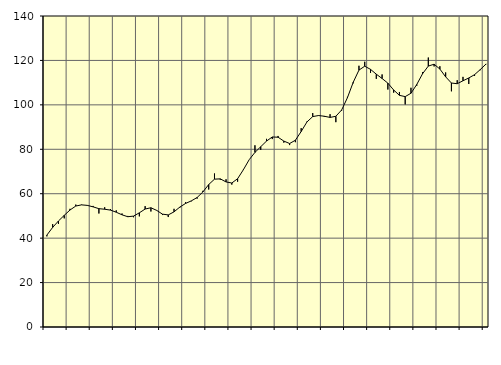
| Category | Piggar | Series 1 |
|---|---|---|
| nan | 40.8 | 41.38 |
| 1.0 | 46.3 | 44.83 |
| 1.0 | 46.4 | 47.72 |
| 1.0 | 48.9 | 50.26 |
| nan | 53.2 | 52.66 |
| 2.0 | 55.1 | 54.45 |
| 2.0 | 55.1 | 54.98 |
| 2.0 | 54.6 | 54.75 |
| nan | 54.5 | 54.08 |
| 3.0 | 51.1 | 53.27 |
| 3.0 | 53.9 | 53.01 |
| 3.0 | 53.1 | 52.62 |
| nan | 52.5 | 51.67 |
| 4.0 | 51.1 | 50.5 |
| 4.0 | 50 | 49.64 |
| 4.0 | 49.4 | 49.92 |
| nan | 49.8 | 51.4 |
| 5.0 | 54.4 | 53.1 |
| 5.0 | 52 | 53.68 |
| 5.0 | 52.4 | 52.49 |
| nan | 50.4 | 50.8 |
| 6.0 | 49.5 | 50.46 |
| 6.0 | 53.2 | 51.84 |
| 6.0 | 53.7 | 53.98 |
| nan | 56.2 | 55.62 |
| 7.0 | 56.6 | 56.79 |
| 7.0 | 57.8 | 58.3 |
| 7.0 | 61.3 | 60.81 |
| nan | 61.9 | 64.13 |
| 8.0 | 69.1 | 66.55 |
| 8.0 | 66.3 | 66.69 |
| 8.0 | 66.5 | 65.3 |
| nan | 64.1 | 64.83 |
| 9.0 | 65.4 | 66.75 |
| 9.0 | 71 | 70.8 |
| 9.0 | 75.3 | 75.3 |
| nan | 81.8 | 78.6 |
| 10.0 | 79.7 | 81.15 |
| 10.0 | 84.7 | 83.69 |
| 10.0 | 84.6 | 85.54 |
| nan | 86 | 85.43 |
| 11.0 | 83 | 83.69 |
| 11.0 | 81.9 | 82.6 |
| 11.0 | 83.2 | 84.07 |
| nan | 89.5 | 88.01 |
| 12.0 | 92.5 | 92.3 |
| 12.0 | 96.3 | 94.72 |
| 12.0 | 95.3 | 95.19 |
| nan | 94.6 | 94.88 |
| 13.0 | 95.8 | 94.34 |
| 13.0 | 92.2 | 94.86 |
| 13.0 | 97.4 | 97.69 |
| nan | 103.6 | 103.2 |
| 14.0 | 109.7 | 110.14 |
| 14.0 | 117.6 | 115.65 |
| 14.0 | 119.4 | 117.4 |
| nan | 114.4 | 115.98 |
| 15.0 | 111.7 | 113.81 |
| 15.0 | 113.7 | 111.87 |
| 15.0 | 106.9 | 109.77 |
| nan | 105.5 | 106.7 |
| 16.0 | 105.8 | 104.28 |
| 16.0 | 100.2 | 103.71 |
| 16.0 | 107.7 | 105.22 |
| nan | 108.6 | 109.16 |
| 17.0 | 114.7 | 113.99 |
| 17.0 | 121.3 | 117.46 |
| 17.0 | 117.3 | 118.29 |
| nan | 117.4 | 116.12 |
| 18.0 | 114.6 | 112.61 |
| 18.0 | 106.1 | 109.83 |
| 18.0 | 111.1 | 109.51 |
| nan | 112.6 | 110.84 |
| 19.0 | 109.4 | 112.1 |
| 19.0 | 113 | 113.59 |
| 19.0 | 115.6 | 115.91 |
| nan | 118.3 | 118.42 |